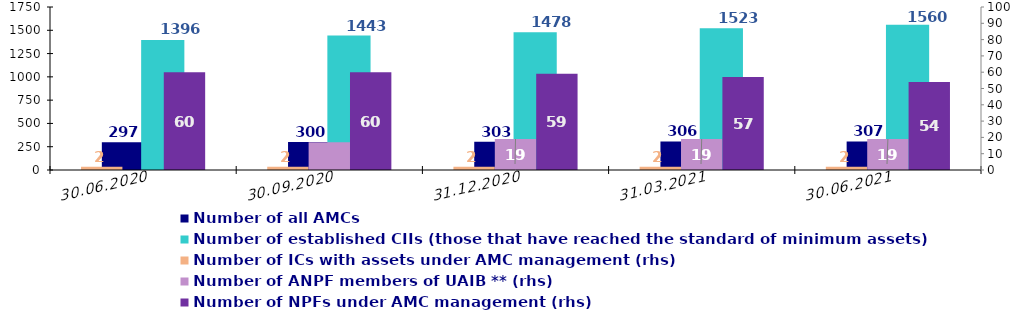
| Category | Number of all AMCs | Number of AMCs with CII under management | Number of CIIs under management | Number of established CIIs (those that have reached the standard of minimum assets) |
|---|---|---|---|---|
| 30.06.2020 | 297 |  |  | 1396 |
| 30.09.2020 | 300 |  |  | 1443 |
| 31.12.2020 | 303 |  |  | 1478 |
| 31.03.2021 | 306 |  |  | 1523 |
| 30.06.2021 | 307 |  |  | 1560 |